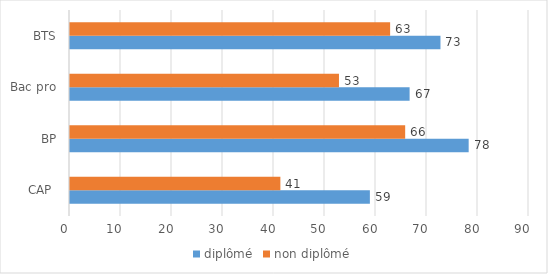
| Category | diplômé | non diplômé |
|---|---|---|
| CAP  | 58.8 | 41.25 |
| BP | 78.17 | 65.72 |
| Bac pro | 66.59 | 52.74 |
| BTS | 72.64 | 62.77 |